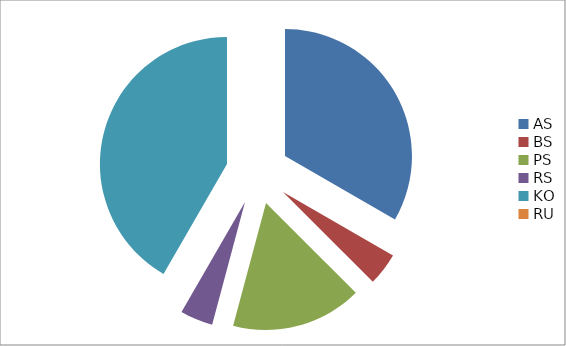
| Category | Series 0 |
|---|---|
| AS | 8 |
| BS | 1 |
| PS | 4 |
| RS | 1 |
| KO | 10 |
| RU | 0 |